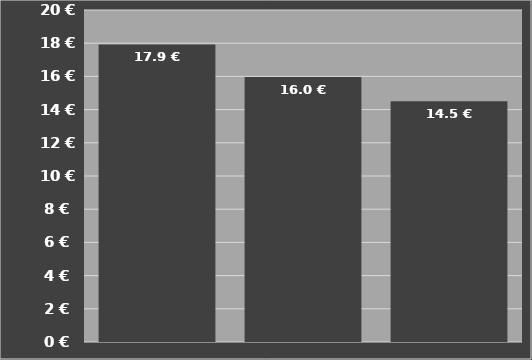
| Category | Kosten je Hektar
inklusive Schlepper |
|---|---|
| SIP Air 300 F Alp Bandschwader | 17.925 |
| SIP Air 300 F Alp Bandschwader | 15.971 |
| SIP Air 300 F Alp Bandschwader | 14.506 |